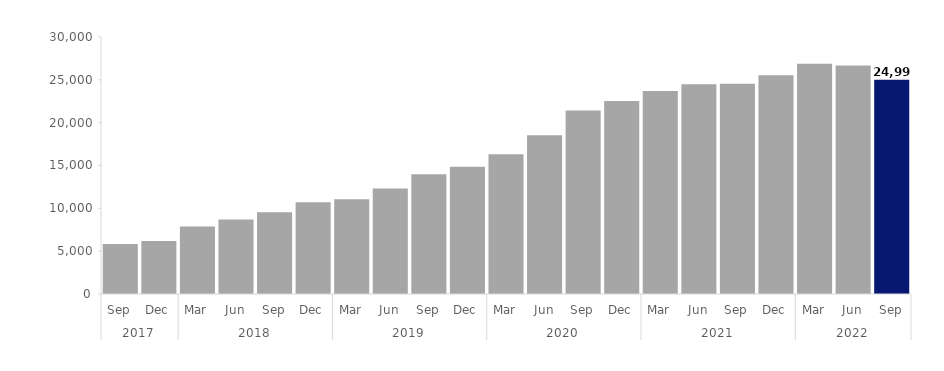
| Category | Series 0 |
|---|---|
| 0 | 5844 |
| 1 | 6180 |
| 2 | 7890 |
| 3 | 8703 |
| 4 | 9537 |
| 5 | 10713 |
| 6 | 11067 |
| 7 | 12309 |
| 8 | 13965 |
| 9 | 14868 |
| 10 | 16308 |
| 11 | 18522 |
| 12 | 21414 |
| 13 | 22521 |
| 14 | 23688 |
| 15 | 24474 |
| 16 | 24546 |
| 17 | 25524 |
| 18 | 26868 |
| 19 | 26664 |
| 20 | 24996 |